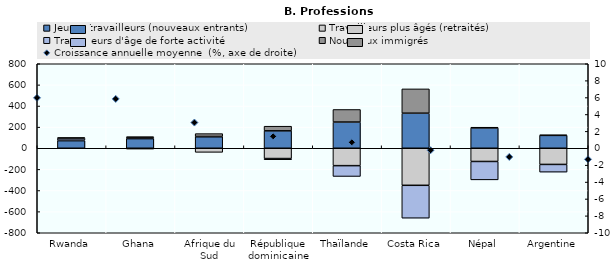
| Category | Jeunes travailleurs (nouveaux entrants) | Travailleurs plus âgés (retraités) | Travailleurs d'âge de forte activité | Nouveaux immigrés |
|---|---|---|---|---|
| Rwanda | 71.875 | 4.684 | 19.971 | 3.47 |
| Ghana | 91.192 | -7.935 | 12.339 | 4.404 |
| Afrique du Sud | 109.81 | -38.725 | 1.604 | 27.312 |
| République dominicaine | 165.052 | -97.405 | -11.413 | 43.766 |
| Thaïlande | 248.152 | -164.697 | -102.454 | 118.999 |
| Costa Rica | 332.034 | -350.792 | -311.328 | 230.085 |
| Népal | 192.654 | -125.036 | -174.102 | 6.483 |
| Argentine | 122.039 | -153.036 | -73.073 | 4.071 |